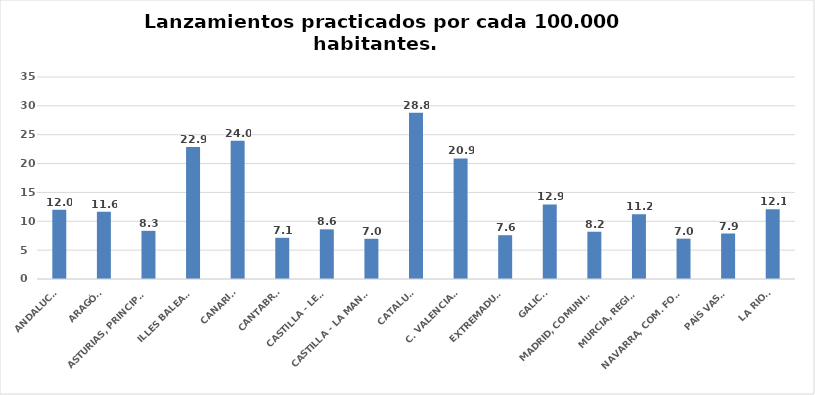
| Category | Series 0 |
|---|---|
| ANDALUCÍA | 12.018 |
| ARAGÓN | 11.635 |
| ASTURIAS, PRINCIPADO | 8.345 |
| ILLES BALEARS | 22.872 |
| CANARIAS | 23.95 |
| CANTABRIA | 7.136 |
| CASTILLA - LEÓN | 8.604 |
| CASTILLA - LA MANCHA | 6.969 |
| CATALUÑA | 28.788 |
| C. VALENCIANA | 20.888 |
| EXTREMADURA | 7.588 |
| GALICIA | 12.927 |
| MADRID, COMUNIDAD | 8.191 |
| MURCIA, REGIÓN | 11.206 |
| NAVARRA, COM. FORAL | 6.992 |
| PAÍS VASCO | 7.883 |
| LA RIOJA | 12.102 |